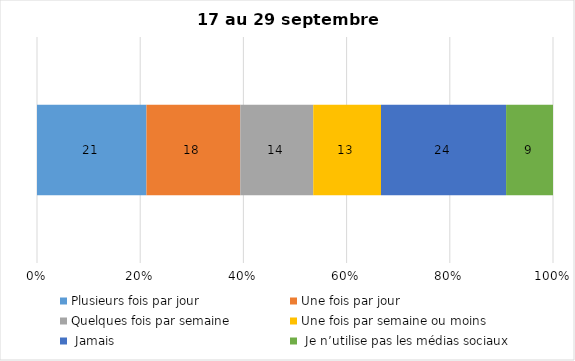
| Category | Plusieurs fois par jour | Une fois par jour | Quelques fois par semaine   | Une fois par semaine ou moins   |  Jamais   |  Je n’utilise pas les médias sociaux |
|---|---|---|---|---|---|---|
| 0 | 21 | 18 | 14 | 13 | 24 | 9 |